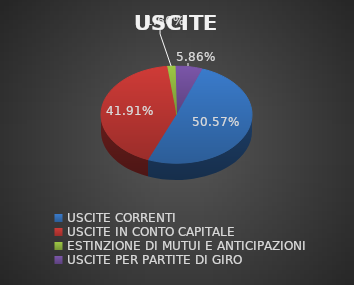
| Category | USCITE |
|---|---|
| USCITE CORRENTI | 0.506 |
| USCITE IN CONTO CAPITALE | 0.419 |
| ESTINZIONE DI MUTUI E ANTICIPAZIONI | 0.017 |
| USCITE PER PARTITE DI GIRO | 0.059 |